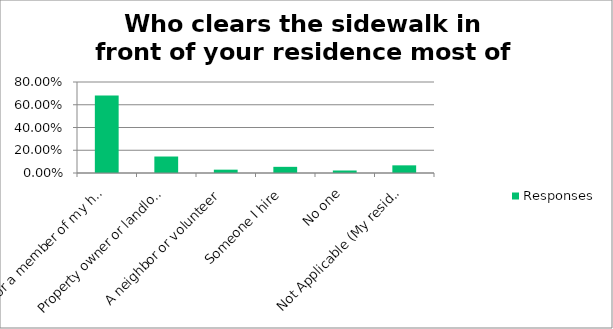
| Category | Responses |
|---|---|
| Me or a member of my household | 0.682 |
| Property owner or landlord | 0.145 |
| A neighbor or volunteer | 0.029 |
| Someone I hire | 0.054 |
| No one | 0.022 |
| Not Applicable (My residence has no sidewalk to clear) | 0.067 |